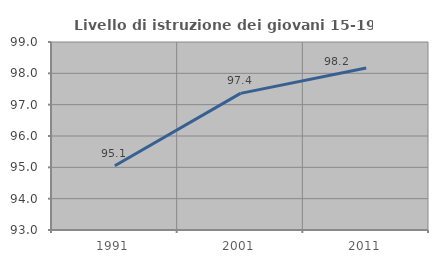
| Category | Livello di istruzione dei giovani 15-19 anni |
|---|---|
| 1991.0 | 95.052 |
| 2001.0 | 97.36 |
| 2011.0 | 98.168 |